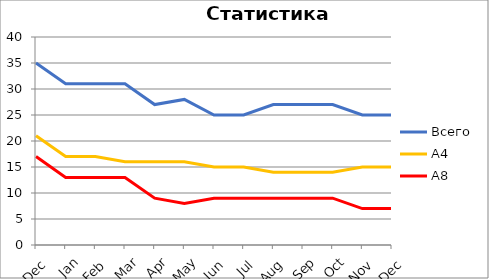
| Category | Всего | А4 | A8 |
|---|---|---|---|
| 0 | 35 | 21 | 17 |
| 1 | 31 | 17 | 13 |
| 2 | 31 | 17 | 13 |
| 3 | 31 | 16 | 13 |
| 4 | 27 | 16 | 9 |
| 5 | 28 | 16 | 8 |
| 6 | 25 | 15 | 9 |
| 7 | 25 | 15 | 9 |
| 8 | 27 | 14 | 9 |
| 9 | 27 | 14 | 9 |
| 10 | 27 | 14 | 9 |
| 11 | 25 | 15 | 7 |
| 12 | 25 | 15 | 7 |